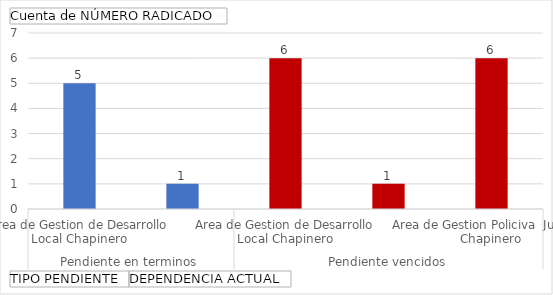
| Category | Total |
|---|---|
| 0 | 5 |
| 1 | 1 |
| 2 | 6 |
| 3 | 1 |
| 4 | 6 |